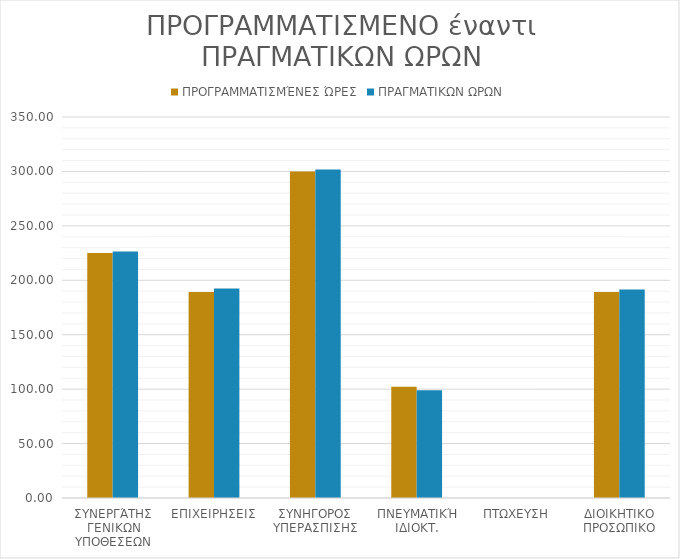
| Category | ΠΡΟΓΡΑΜΜΑΤΙΣΜΈΝΕΣ ΏΡΕΣ | ΠΡΑΓΜΑΤΙΚΩΝ ΩΡΩΝ |
|---|---|---|
| ΣΥΝΕΡΓΆΤΗΣ ΓΕΝΙΚΩΝ ΥΠΟΘΕΣΕΩΝ | 225 | 226.5 |
| ΕΠΙΧΕΙΡΗΣΕΙΣ | 189.286 | 192.5 |
| ΣΥΝΗΓΟΡΟΣ ΥΠΕΡΑΣΠΙΣΗΣ | 300 | 301.714 |
| ΠΝΕΥΜΑΤΙΚΉ ΙΔΙΟΚΤ. | 102.143 | 99 |
| ΠΤΩΧΕΥΣΗ | 0 | 0 |
| ΔΙΟΙΚΗΤΙΚΟ ΠΡΟΣΩΠΙΚΟ | 189.286 | 191.429 |